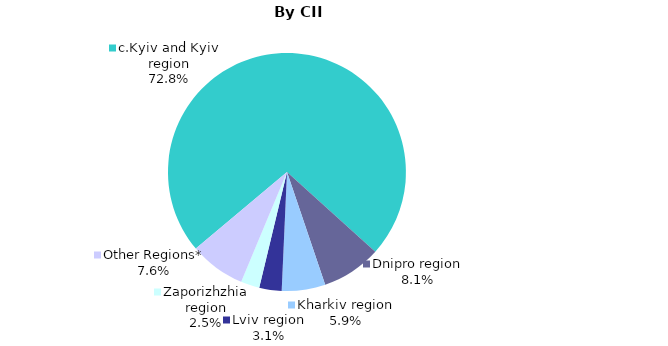
| Category | By CII Number |
|---|---|
| c.Kyiv and Kyiv region | 0.728 |
| Dnipro region | 0.081 |
| Kharkiv region | 0.059 |
| Lviv region | 0.03 |
| Zaporizhzhia region | 0.025 |
| Other Regions* | 0.076 |